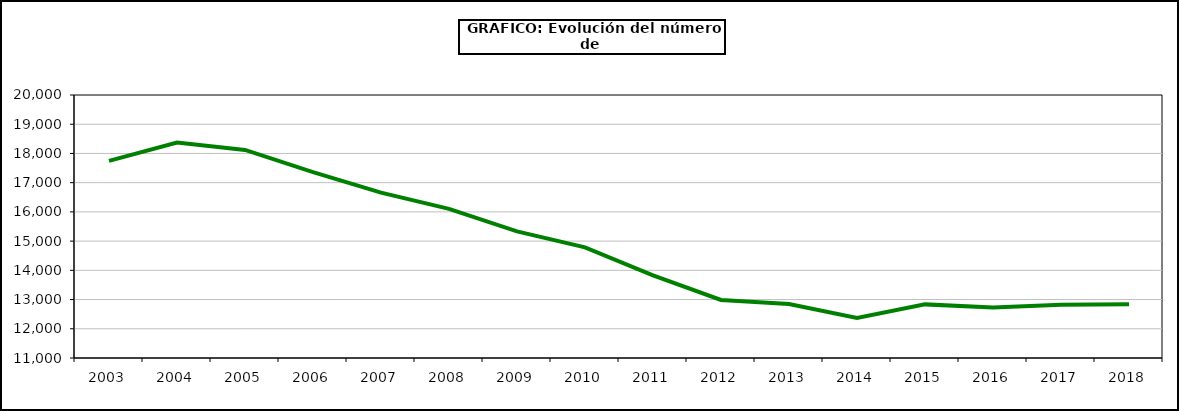
| Category | Lana |
|---|---|
| 2003.0 | 17744.754 |
| 2004.0 | 18373.709 |
| 2005.0 | 18119.109 |
| 2006.0 | 17360.572 |
| 2007.0 | 16660.647 |
| 2008.0 | 16105.475 |
| 2009.0 | 15330.854 |
| 2010.0 | 14786 |
| 2011.0 | 13830.488 |
| 2012.0 | 12986.682 |
| 2013.0 | 12849.185 |
| 2014.0 | 12369.399 |
| 2015.0 | 12834.9 |
| 2016.0 | 12731.005 |
| 2017.0 | 12825.033 |
| 2018.0 | 12836.451 |